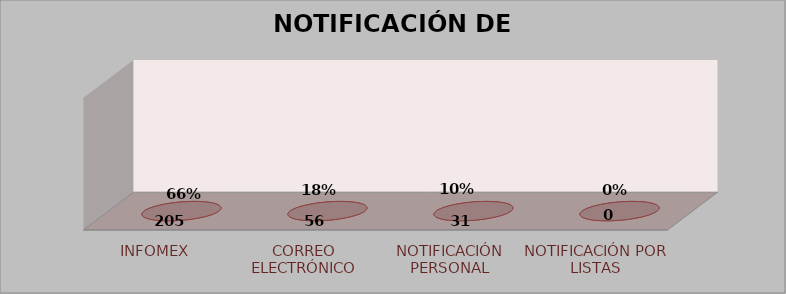
| Category | Series 0 | Series 1 | Series 2 | Series 3 |
|---|---|---|---|---|
| INFOMEX |  |  | 0 | 0 |
| CORREO ELECTRÓNICO |  |  | 0 | 0 |
| NOTIFICACIÓN PERSONAL |  |  | 0 | 0 |
| NOTIFICACIÓN POR LISTAS |  |  | 0 | 0 |